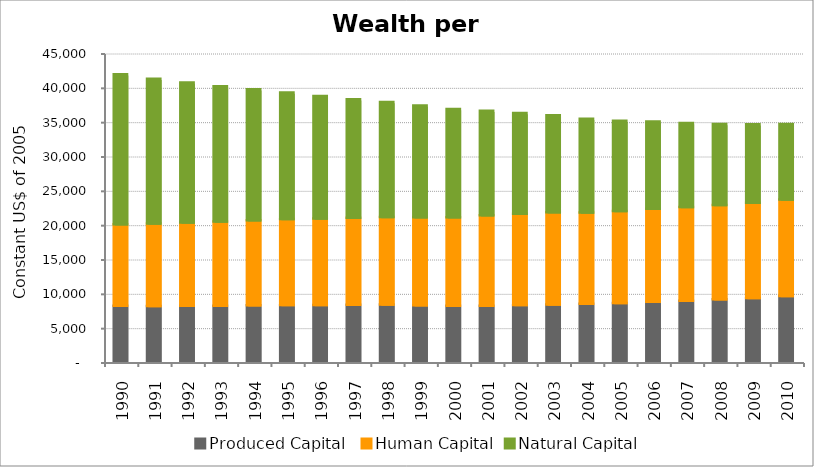
| Category | Produced Capital  | Human Capital | Natural Capital |
|---|---|---|---|
| 1990.0 | 8144.976 | 11889.316 | 21819.587 |
| 1991.0 | 8134.341 | 12006.138 | 21087.316 |
| 1992.0 | 8151.292 | 12136.303 | 20375.676 |
| 1993.0 | 8168.293 | 12272.015 | 19690.006 |
| 1994.0 | 8215.575 | 12396.862 | 19060.935 |
| 1995.0 | 8249.212 | 12522.914 | 18433.095 |
| 1996.0 | 8261.114 | 12601.435 | 17827.248 |
| 1997.0 | 8285.987 | 12669.624 | 17282.787 |
| 1998.0 | 8325.578 | 12738.534 | 16763.786 |
| 1999.0 | 8220.562 | 12826.471 | 16262.74 |
| 2000.0 | 8154.181 | 12896.82 | 15750.856 |
| 2001.0 | 8170.471 | 13172.246 | 15196.674 |
| 2002.0 | 8262.655 | 13297.36 | 14654.822 |
| 2003.0 | 8338.508 | 13425.018 | 14128.02 |
| 2004.0 | 8429.355 | 13293.865 | 13660.775 |
| 2005.0 | 8569.963 | 13368.623 | 13167.128 |
| 2006.0 | 8720.625 | 13569.906 | 12688.202 |
| 2007.0 | 8872.668 | 13655.612 | 12236.955 |
| 2008.0 | 9110.477 | 13715.889 | 11812.506 |
| 2009.0 | 9298.133 | 13874.131 | 11414.744 |
| 2010.0 | 9563.935 | 14049.71 | 11012.439 |